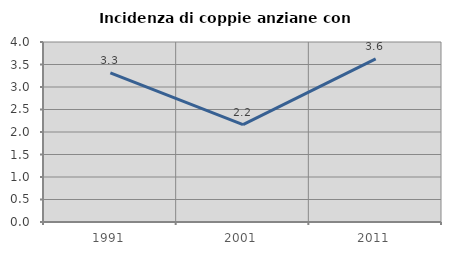
| Category | Incidenza di coppie anziane con figli |
|---|---|
| 1991.0 | 3.315 |
| 2001.0 | 2.162 |
| 2011.0 | 3.627 |